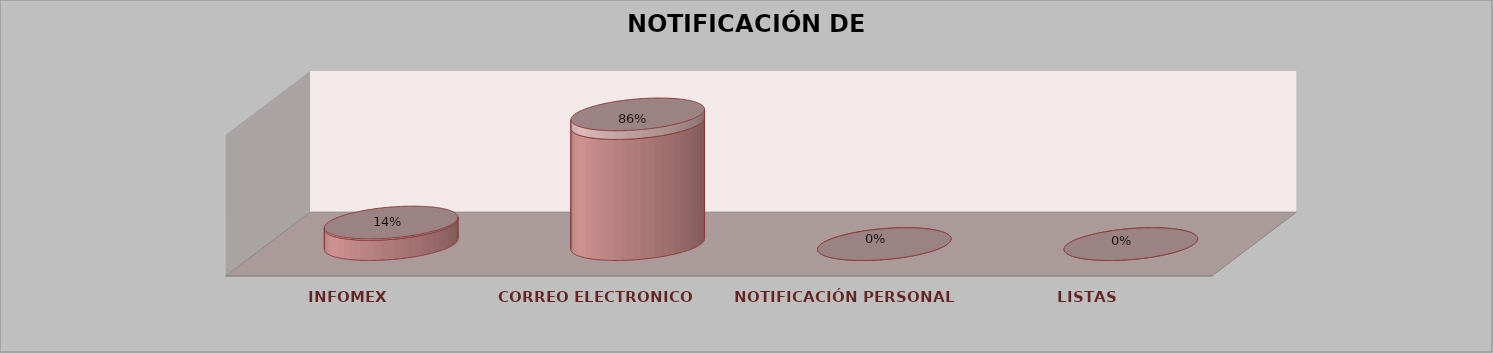
| Category | Series 0 | Series 1 | Series 2 | Series 3 | Series 4 |
|---|---|---|---|---|---|
| INFOMEX |  |  |  | 2 | 0.14 |
| CORREO ELECTRONICO |  |  |  | 12 | 0.86 |
| NOTIFICACIÓN PERSONAL |  |  |  | 0 | 0 |
| LISTAS |  |  |  | 0 | 0 |